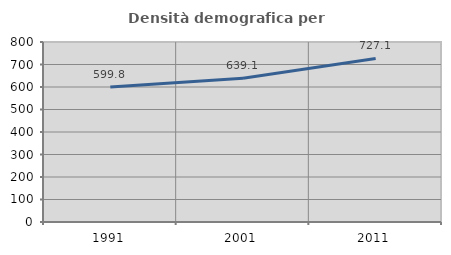
| Category | Densità demografica |
|---|---|
| 1991.0 | 599.845 |
| 2001.0 | 639.077 |
| 2011.0 | 727.097 |